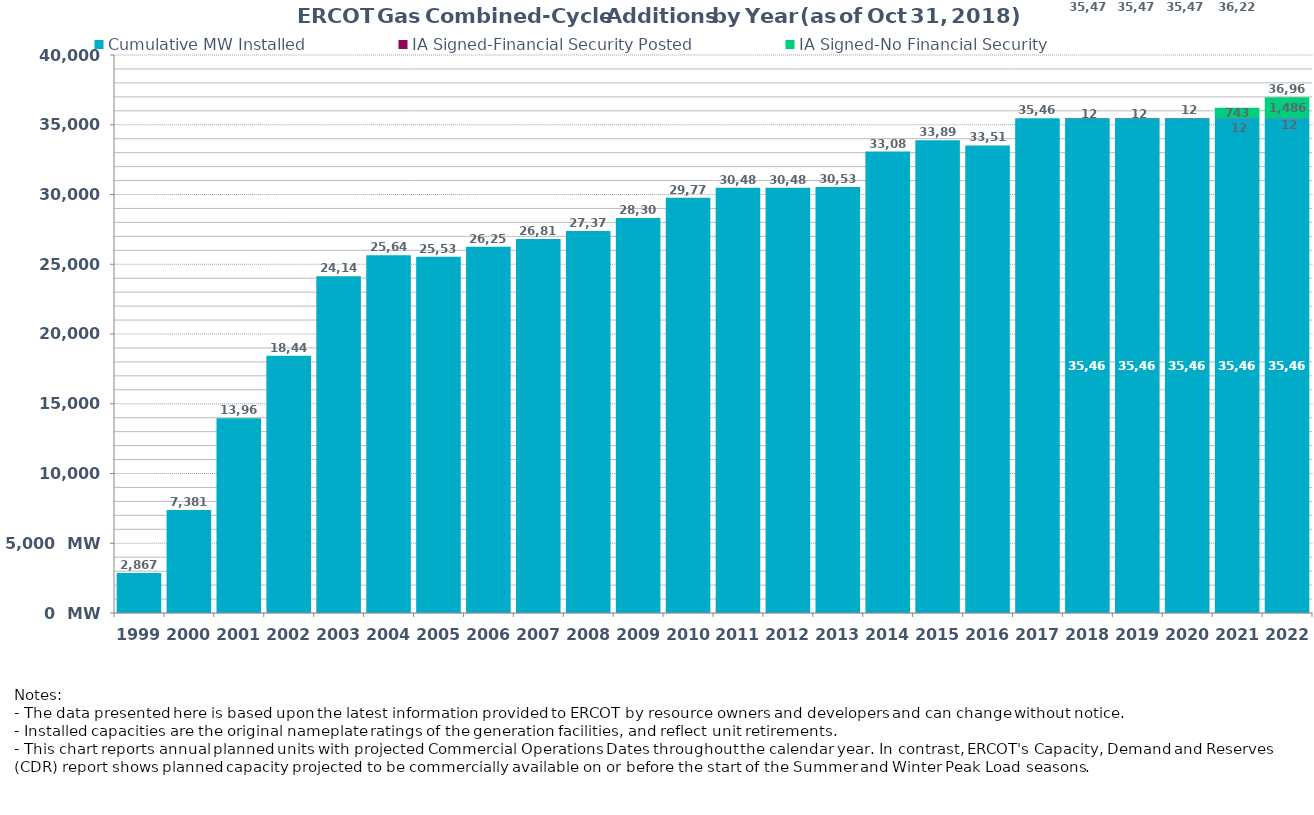
| Category | Cumulative MW Installed | IA Signed-Financial Security Posted  | IA Signed-No Financial Security  | Cumulative Installed and Planned |
|---|---|---|---|---|
| 1999.0 | 2867 | 0 | 0 | 2867 |
| 2000.0 | 7381 | 0 | 0 | 7381 |
| 2001.0 | 13967 | 0 | 0 | 13967 |
| 2002.0 | 18443 | 0 | 0 | 18443 |
| 2003.0 | 24141 | 0 | 0 | 24141 |
| 2004.0 | 25641 | 0 | 0 | 25641 |
| 2005.0 | 25539 | 0 | 0 | 25539 |
| 2006.0 | 26258 | 0 | 0 | 26258 |
| 2007.0 | 26815 | 0 | 0 | 26815 |
| 2008.0 | 27376 | 0 | 0 | 27376 |
| 2009.0 | 28309 | 0 | 0 | 28309 |
| 2010.0 | 29770 | 0 | 0 | 29770 |
| 2011.0 | 30488 | 0 | 0 | 30488 |
| 2012.0 | 30488 | 0 | 0 | 30488 |
| 2013.0 | 30538 | 0 | 0 | 30538 |
| 2014.0 | 33080 | 0 | 0 | 33080 |
| 2015.0 | 33897 | 0 | 0 | 33897 |
| 2016.0 | 33515 | 0 | 0 | 33515 |
| 2017.0 | 35465 | 0 | 0 | 35465 |
| 2018.0 | 35465 | 12 | 0 | 35477 |
| 2019.0 | 35465 | 12 | 0 | 35477 |
| 2020.0 | 35465 | 12 | 0 | 35477 |
| 2021.0 | 35465 | 12 | 742.9 | 36219.9 |
| 2022.0 | 35465 | 12 | 1485.8 | 36962.8 |